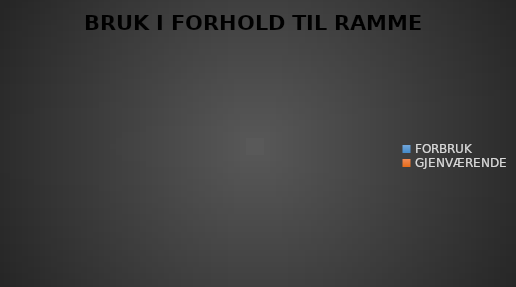
| Category | BRUK I FORHOLD TIL RAMME 2020 |
|---|---|
| FORBRUK | 0 |
| GJENVÆRENDE | 0 |